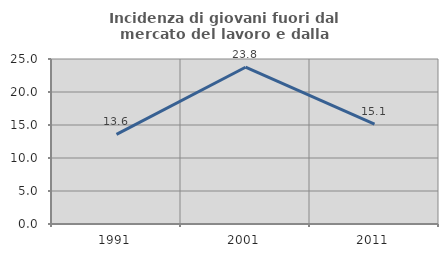
| Category | Incidenza di giovani fuori dal mercato del lavoro e dalla formazione  |
|---|---|
| 1991.0 | 13.57 |
| 2001.0 | 23.752 |
| 2011.0 | 15.12 |